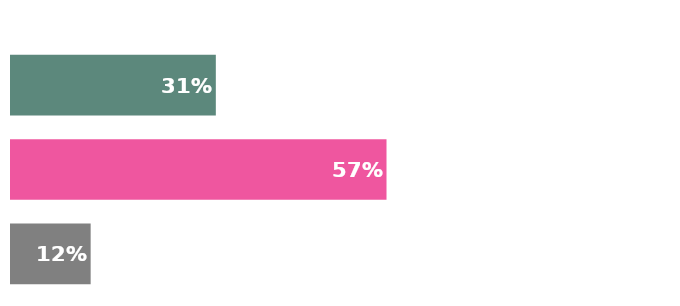
| Category | Total |
|---|---|
| Will spend about the same | 0.121 |
| Will spend less | 0.569 |
| Will spend more | 0.31 |